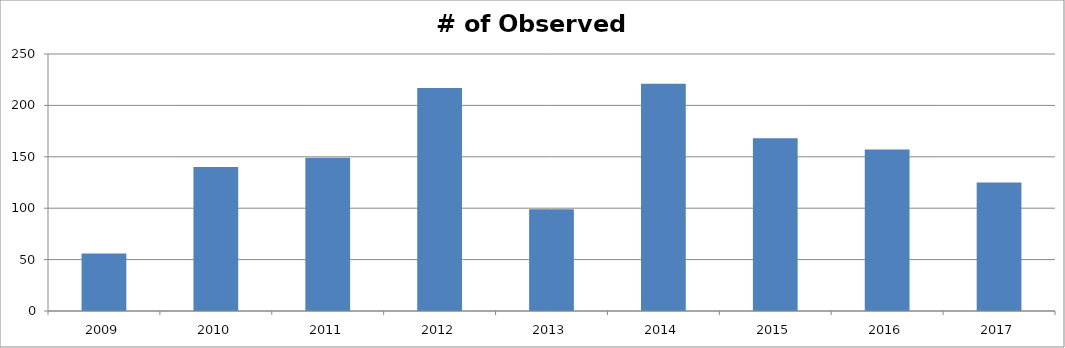
| Category | # of Observed Stands |
|---|---|
| 2009.0 | 56 |
| 2010.0 | 140 |
| 2011.0 | 149 |
| 2012.0 | 217 |
| 2013.0 | 99 |
| 2014.0 | 221 |
| 2015.0 | 168 |
| 2016.0 | 157 |
| 2017.0 | 125 |